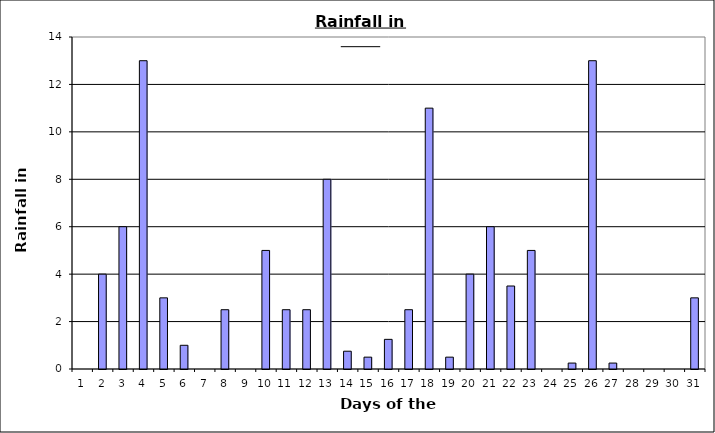
| Category | Series 0 |
|---|---|
| 0 | 0 |
| 1 | 4 |
| 2 | 6 |
| 3 | 13 |
| 4 | 3 |
| 5 | 1 |
| 6 | 0 |
| 7 | 2.5 |
| 8 | 0 |
| 9 | 5 |
| 10 | 2.5 |
| 11 | 2.5 |
| 12 | 8 |
| 13 | 0.75 |
| 14 | 0.5 |
| 15 | 1.25 |
| 16 | 2.5 |
| 17 | 11 |
| 18 | 0.5 |
| 19 | 4 |
| 20 | 6 |
| 21 | 3.5 |
| 22 | 5 |
| 23 | 0 |
| 24 | 0.25 |
| 25 | 13 |
| 26 | 0.25 |
| 27 | 0 |
| 28 | 0 |
| 29 | 0 |
| 30 | 3 |